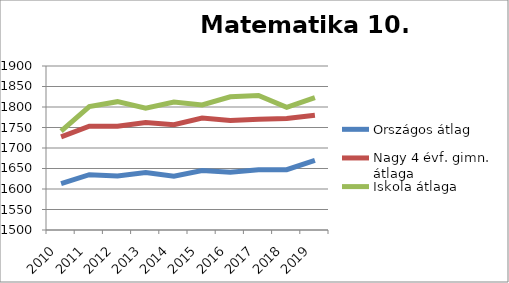
| Category | Országos átlag | Nagy 4 évf. gimn. átlaga | Iskola átlaga |
|---|---|---|---|
| 2010.0 | 1613 | 1727 | 1741 |
| 2011.0 | 1635 | 1753 | 1801 |
| 2012.0 | 1632 | 1753 | 1813 |
| 2013.0 | 1640 | 1762 | 1797 |
| 2014.0 | 1631 | 1757 | 1812 |
| 2015.0 | 1645 | 1773 | 1805 |
| 2016.0 | 1641 | 1767 | 1825 |
| 2017.0 | 1647 | 1770 | 1828 |
| 2018.0 | 1647 | 1772 | 1799 |
| 2019.0 | 1670 | 1780 | 1823 |